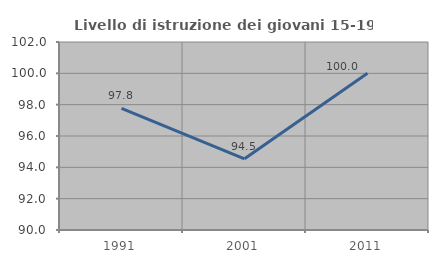
| Category | Livello di istruzione dei giovani 15-19 anni |
|---|---|
| 1991.0 | 97.758 |
| 2001.0 | 94.545 |
| 2011.0 | 100 |